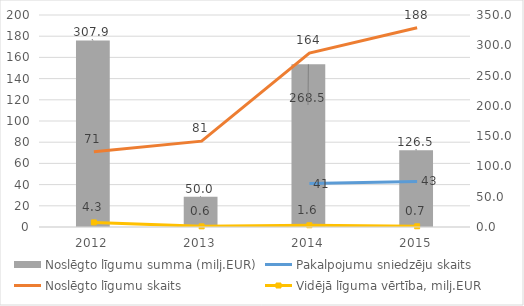
| Category | Noslēgto līgumu summa (milj.EUR) |
|---|---|
| 2012.0 | 307.912 |
| 2013.0 | 50.012 |
| 2014.0 | 268.503 |
| 2015.0 | 126.516 |